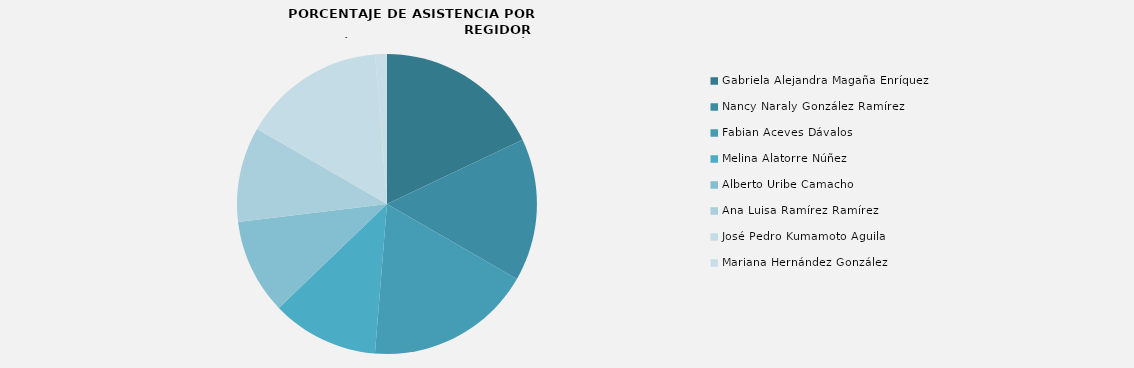
| Category | Gabriela Alejandra Magaña Enríquez |
|---|---|
| Gabriela Alejandra Magaña Enríquez | 100 |
| Nancy Naraly González Ramírez | 85.714 |
| Fabian Aceves Dávalos | 100 |
| Melina Alatorre Núñez | 64.286 |
| Alberto Uribe Camacho | 57.143 |
| Ana Luisa Ramírez Ramírez | 57.143 |
| José Pedro Kumamoto Aguila | 85.714 |
| Mariana Hernández González | 7.143 |